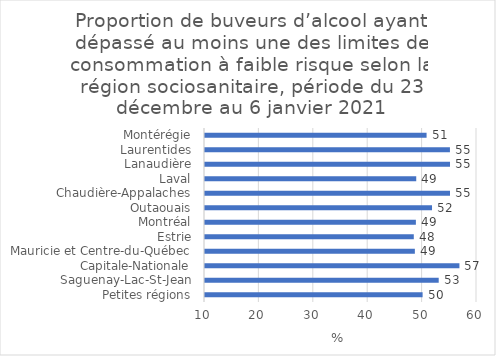
| Category | Series 0 |
|---|---|
| Petites régions | 50.001 |
| Saguenay-Lac-St-Jean | 52.961 |
| Capitale-Nationale | 56.769 |
| Mauricie et Centre-du-Québec | 48.577 |
| Estrie | 48.381 |
| Montréal | 48.765 |
| Outaouais | 51.731 |
| Chaudière-Appalaches | 55.037 |
| Laval | 48.83 |
| Lanaudière | 55.038 |
| Laurentides | 55.024 |
| Montérégie | 50.731 |